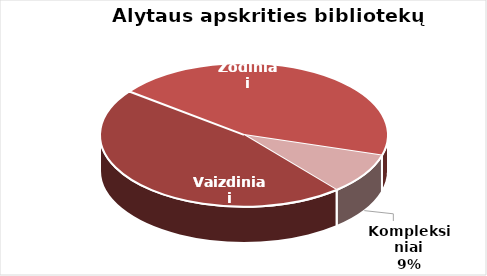
| Category | Series 0 |
|---|---|
| Vaizdiniai | 1616 |
| Žodiniai | 1542 |
| Kompleksiniai | 322 |